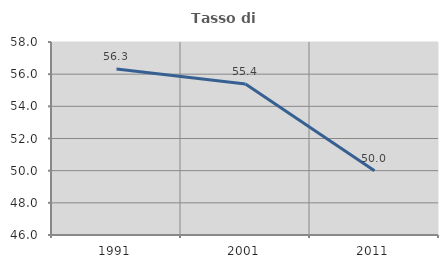
| Category | Tasso di occupazione   |
|---|---|
| 1991.0 | 56.322 |
| 2001.0 | 55.396 |
| 2011.0 | 50 |